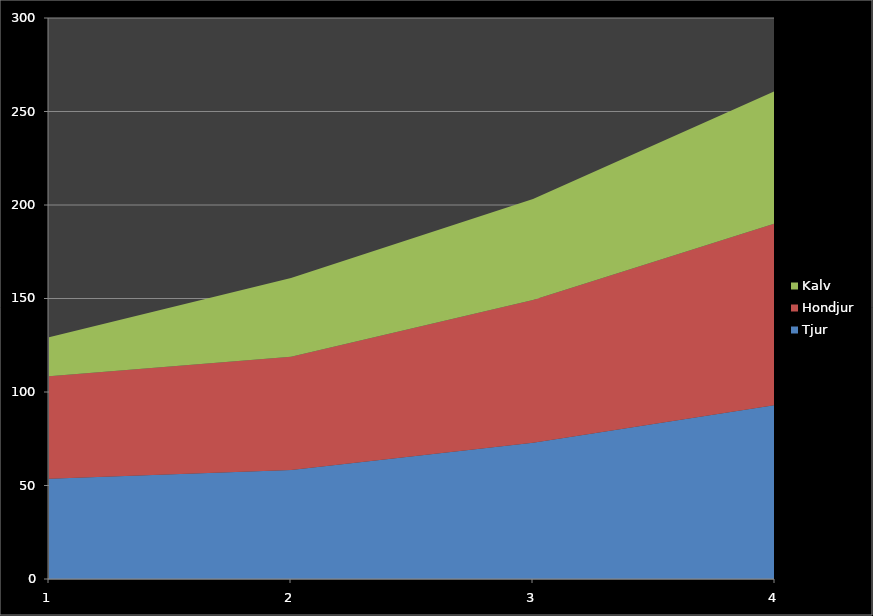
| Category | Tjur | Hondjur | Kalv |
|---|---|---|---|
| 0 | 53.549 | 54.81 | 20.891 |
| 1 | 58.27 | 60.645 | 42.034 |
| 2 | 72.798 | 76.396 | 53.976 |
| 3 | 92.953 | 97.249 | 70.685 |